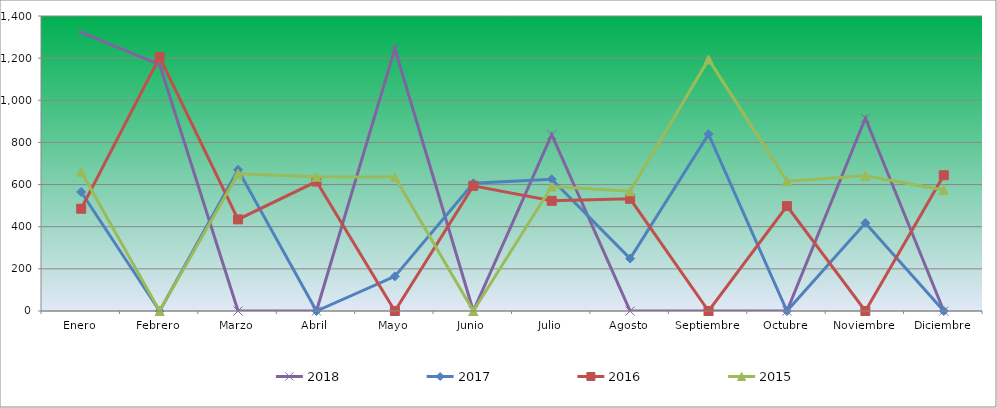
| Category | 2018 | 2017 | 2016 | 2015 |
|---|---|---|---|---|
| Enero | 1322.749 | 564.834 | 485.255 | 661.056 |
| Febrero | 1169.732 | 0 | 1205.259 | 0 |
| Marzo | 0 | 670.142 | 434.839 | 651.452 |
| Abril | 0 | 0 | 614.446 | 637.047 |
| Mayo | 1244.54 | 164.344 | 0 | 635.446 |
| Junio | 0 | 606.319 | 593.964 | 0 |
| Julio | 836.494 | 625.466 | 523.067 | 590.629 |
| Agosto | 0 | 248.91 | 532.52 | 568.22 |
| Septiembre | 0 | 839.273 | 0 | 1194.062 |
| Octubre | 0 | 0 | 497.859 | 616.239 |
| Noviembre | 914.703 | 418.041 | 0 | 641.849 |
| Diciembre | 0 | 0 | 644.38 | 574.623 |